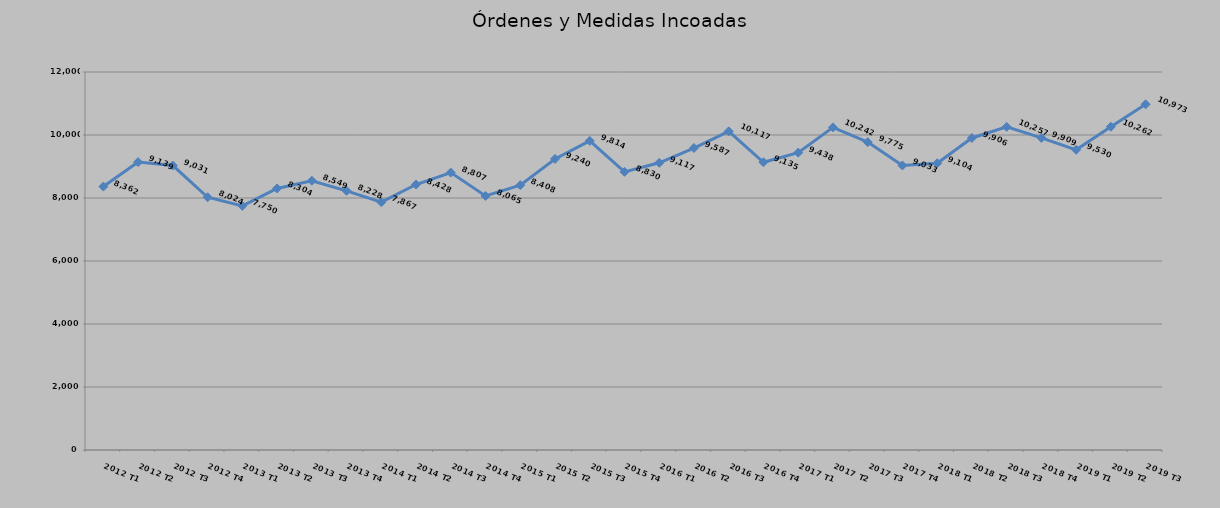
| Category | Órdenes y Medidas incoadas |
|---|---|
| 2012 T1 | 8362 |
| 2012 T2 | 9139 |
| 2012 T3 | 9031 |
| 2012 T4 | 8024 |
| 2013 T1 | 7750 |
| 2013 T2 | 8304 |
| 2013 T3 | 8549 |
| 2013 T4 | 8228 |
| 2014 T1 | 7867 |
| 2014 T2 | 8428 |
| 2014 T3 | 8807 |
| 2014 T4 | 8065 |
| 2015 T1 | 8408 |
| 2015 T2 | 9240 |
| 2015 T3 | 9814 |
| 2015 T4 | 8830 |
| 2016 T1 | 9117 |
| 2016 T2 | 9587 |
| 2016 T3 | 10117 |
| 2016 T4 | 9135 |
| 2017 T1 | 9438 |
| 2017 T2 | 10242 |
| 2017 T3 | 9775 |
| 2017 T4 | 9033 |
| 2018 T1 | 9104 |
| 2018 T2 | 9906 |
| 2018 T3 | 10257 |
| 2018 T4 | 9909 |
| 2019 T1 | 9530 |
| 2019 T2 | 10262 |
| 2019 T3 | 10973 |